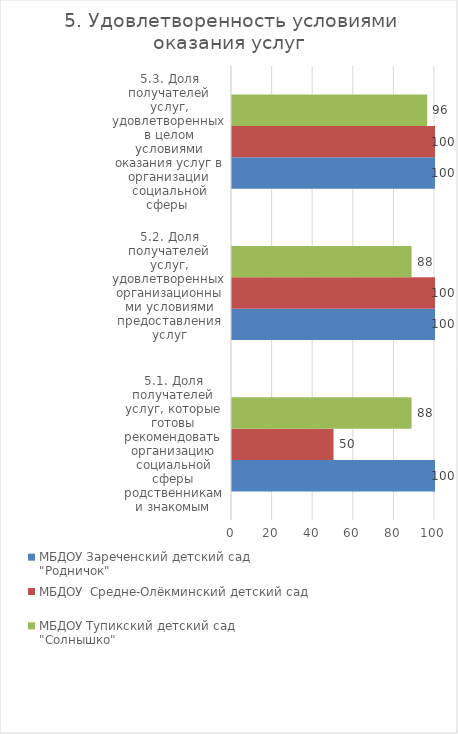
| Category | МБДОУ Зареченский детский сад  "Родничок" | МБДОУ  Средне-Олёкминский детский сад  | МБДОУ Тупикский детский сад  "Солнышко" |
|---|---|---|---|
| 5.1. Доля получателей услуг, которые готовы рекомендовать организацию социальной сферы родственникам и знакомым | 100 | 50 | 88.462 |
| 5.2. Доля получателей услуг, удовлетворенных организационными условиями предоставления услуг | 100 | 100 | 88.462 |
| 5.3. Доля получателей услуг, удовлетворенных в целом условиями оказания услуг в организации социальной сферы  | 100 | 100 | 96.154 |